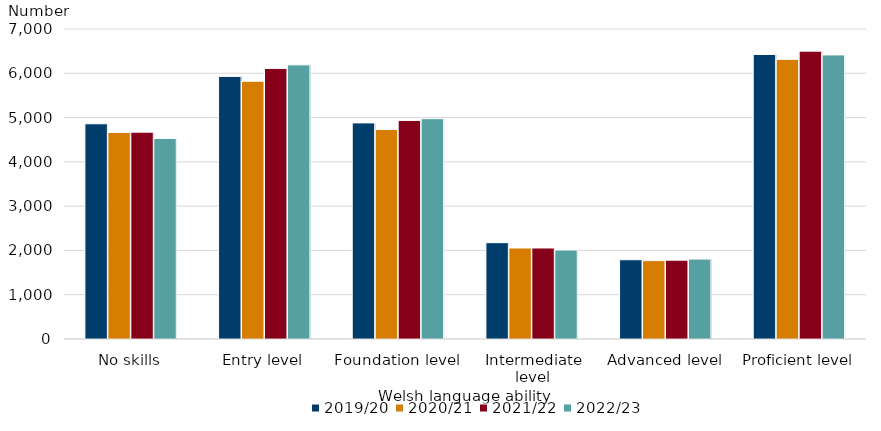
| Category | 2019/20 | 2020/21 | 2021/22 | 2022/23 |
|---|---|---|---|---|
| No skills | 4860 | 4665 | 4670 | 4530 |
| Entry level | 5930 | 5820 | 6110 | 6190 |
| Foundation level | 4880 | 4730 | 4935 | 4975 |
| Intermediate level | 2175 | 2055 | 2055 | 2010 |
| Advanced level | 1790 | 1770 | 1780 | 1805 |
| Proficient level | 6425 | 6315 | 6500 | 6415 |